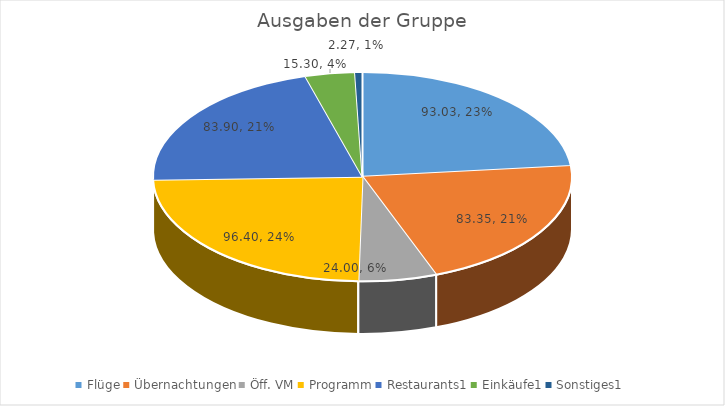
| Category | Series 0 |
|---|---|
| Flüge | 93.03 |
| Übernachtungen | 83.348 |
| Öff. VM | 23.996 |
| Programm | 96.403 |
| Restaurants1 | 83.905 |
| Einkäufe1 | 15.299 |
| Sonstiges1 | 2.265 |